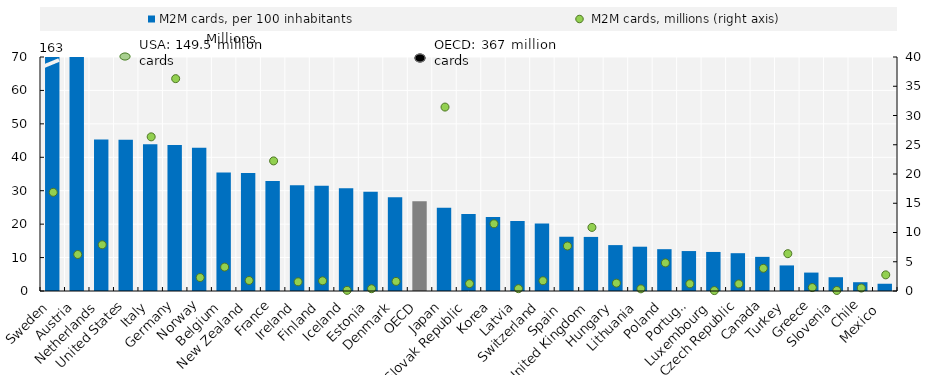
| Category | M2M cards, per 100 inhabitants  |
|---|---|
| Sweden | 162.98 |
| Austria | 70 |
| Netherlands | 45.32 |
| United States | 45.27 |
| Italy | 43.87 |
| Germany | 43.65 |
| Norway | 42.84 |
| Belgium | 35.45 |
| New Zealand | 35.33 |
| France | 32.87 |
| Ireland | 31.62 |
| Finland | 31.46 |
| Iceland | 30.77 |
| Estonia | 29.72 |
| Denmark | 28.07 |
| OECD | 26.82 |
| Japan | 24.93 |
| Slovak Republic | 23.03 |
| Korea | 22.15 |
| Latvia | 20.93 |
| Switzerland | 20.2 |
| Spain  | 16.23 |
| United Kingdom | 16.18 |
| Hungary | 13.73 |
| Lithuania | 13.25 |
| Poland | 12.51 |
| Portugal | 11.95 |
| Luxembourg | 11.68 |
| Czech Republic | 11.31 |
| Canada | 10.21 |
| Turkey | 7.65 |
| Greece | 5.51 |
| Slovenia | 4.12 |
| Chile | 2.63 |
| Mexico  | 2.17 |